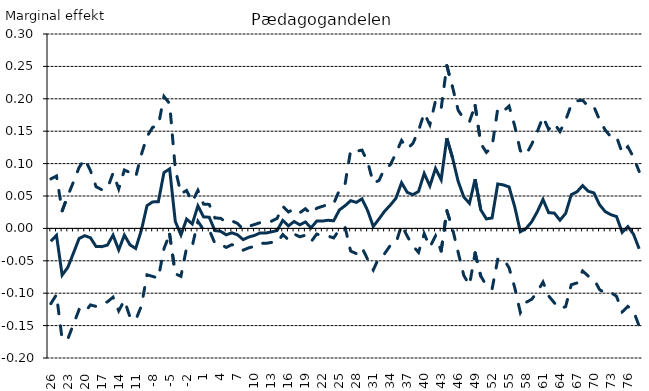
| Category | Estimat | Nedre konfidensgrænse | Øvre konfidensgrænse |
|---|---|---|---|
| -26.0 | -0.02 | -0.116 | 0.076 |
| -25.0 | -0.011 | -0.102 | 0.081 |
| -24.0 | -0.072 | -0.171 | 0.027 |
| -23.0 | -0.06 | -0.171 | 0.05 |
| -22.0 | -0.038 | -0.148 | 0.072 |
| -21.0 | -0.016 | -0.125 | 0.094 |
| -20.0 | -0.011 | -0.13 | 0.107 |
| -19.0 | -0.014 | -0.118 | 0.089 |
| -18.0 | -0.028 | -0.12 | 0.064 |
| -17.0 | -0.028 | -0.116 | 0.06 |
| -16.0 | -0.026 | -0.113 | 0.062 |
| -15.0 | -0.01 | -0.106 | 0.085 |
| -14.0 | -0.033 | -0.127 | 0.061 |
| -13.0 | -0.01 | -0.111 | 0.09 |
| -12.0 | -0.025 | -0.137 | 0.086 |
| -11.0 | -0.031 | -0.141 | 0.079 |
| -10.0 | -0.003 | -0.12 | 0.114 |
| -9.0 | 0.035 | -0.072 | 0.142 |
| -8.0 | 0.041 | -0.074 | 0.156 |
| -7.0 | 0.041 | -0.077 | 0.159 |
| -6.0 | 0.086 | -0.031 | 0.204 |
| -5.0 | 0.092 | -0.009 | 0.193 |
| -4.0 | 0.011 | -0.07 | 0.092 |
| -3.0 | -0.01 | -0.074 | 0.054 |
| -2.0 | 0.014 | -0.03 | 0.059 |
| -1.0 | 0.007 | -0.027 | 0.041 |
| 0.0 | 0.035 | 0.011 | 0.059 |
| 1.0 | 0.018 | -0.002 | 0.037 |
| 2.0 | 0.017 | -0.002 | 0.037 |
| 3.0 | -0.003 | -0.023 | 0.016 |
| 4.0 | -0.004 | -0.024 | 0.016 |
| 5.0 | -0.01 | -0.029 | 0.01 |
| 6.0 | -0.007 | -0.025 | 0.012 |
| 7.0 | -0.01 | -0.028 | 0.008 |
| 8.0 | -0.017 | -0.034 | -0.001 |
| 9.0 | -0.013 | -0.03 | 0.003 |
| 10.0 | -0.011 | -0.028 | 0.006 |
| 11.0 | -0.007 | -0.023 | 0.009 |
| 12.0 | -0.007 | -0.023 | 0.009 |
| 13.0 | -0.005 | -0.022 | 0.011 |
| 14.0 | -0.003 | -0.022 | 0.015 |
| 15.0 | 0.012 | -0.01 | 0.034 |
| 16.0 | 0.004 | -0.018 | 0.025 |
| 17.0 | 0.011 | -0.009 | 0.03 |
| 18.0 | 0.006 | -0.013 | 0.024 |
| 19.0 | 0.01 | -0.01 | 0.03 |
| 20.0 | 0.001 | -0.021 | 0.022 |
| 21.0 | 0.011 | -0.009 | 0.031 |
| 22.0 | 0.011 | -0.011 | 0.034 |
| 23.0 | 0.013 | -0.012 | 0.037 |
| 24.0 | 0.012 | -0.015 | 0.038 |
| 25.0 | 0.028 | -0.002 | 0.059 |
| 26.0 | 0.035 | 0.002 | 0.068 |
| 27.0 | 0.043 | -0.035 | 0.12 |
| 28.0 | 0.04 | -0.039 | 0.119 |
| 29.0 | 0.046 | -0.03 | 0.121 |
| 30.0 | 0.028 | -0.048 | 0.103 |
| 31.0 | 0.003 | -0.064 | 0.07 |
| 32.0 | 0.014 | -0.045 | 0.074 |
| 33.0 | 0.027 | -0.039 | 0.092 |
| 34.0 | 0.036 | -0.026 | 0.098 |
| 35.0 | 0.046 | -0.023 | 0.116 |
| 36.0 | 0.07 | 0.005 | 0.136 |
| 37.0 | 0.056 | -0.012 | 0.123 |
| 38.0 | 0.052 | -0.027 | 0.131 |
| 39.0 | 0.057 | -0.037 | 0.151 |
| 40.0 | 0.085 | -0.008 | 0.178 |
| 41.0 | 0.066 | -0.029 | 0.16 |
| 42.0 | 0.093 | -0.012 | 0.197 |
| 43.0 | 0.075 | -0.035 | 0.185 |
| 44.0 | 0.139 | 0.027 | 0.251 |
| 45.0 | 0.109 | 0 | 0.219 |
| 46.0 | 0.073 | -0.037 | 0.182 |
| 47.0 | 0.048 | -0.073 | 0.169 |
| 48.0 | 0.039 | -0.088 | 0.165 |
| 49.0 | 0.076 | -0.038 | 0.19 |
| 50.0 | 0.029 | -0.074 | 0.131 |
| 51.0 | 0.015 | -0.088 | 0.117 |
| 52.0 | 0.016 | -0.094 | 0.126 |
| 53.0 | 0.069 | -0.048 | 0.185 |
| 54.0 | 0.067 | -0.047 | 0.181 |
| 55.0 | 0.064 | -0.061 | 0.189 |
| 56.0 | 0.033 | -0.091 | 0.158 |
| 57.0 | -0.005 | -0.13 | 0.12 |
| 58.0 | 0 | -0.114 | 0.114 |
| 59.0 | 0.01 | -0.11 | 0.13 |
| 60.0 | 0.026 | -0.098 | 0.149 |
| 61.0 | 0.045 | -0.083 | 0.172 |
| 62.0 | 0.024 | -0.104 | 0.153 |
| 63.0 | 0.024 | -0.115 | 0.162 |
| 64.0 | 0.013 | -0.124 | 0.149 |
| 65.0 | 0.023 | -0.121 | 0.167 |
| 66.0 | 0.052 | -0.087 | 0.191 |
| 67.0 | 0.056 | -0.084 | 0.197 |
| 68.0 | 0.066 | -0.066 | 0.198 |
| 69.0 | 0.057 | -0.074 | 0.188 |
| 70.0 | 0.055 | -0.078 | 0.188 |
| 71.0 | 0.036 | -0.094 | 0.167 |
| 72.0 | 0.026 | -0.1 | 0.152 |
| 73.0 | 0.021 | -0.099 | 0.141 |
| 74.0 | 0.018 | -0.105 | 0.141 |
| 75.0 | -0.006 | -0.129 | 0.117 |
| 76.0 | 0.003 | -0.12 | 0.126 |
| 77.0 | -0.009 | -0.127 | 0.11 |
| 78.0 | -0.032 | -0.151 | 0.088 |